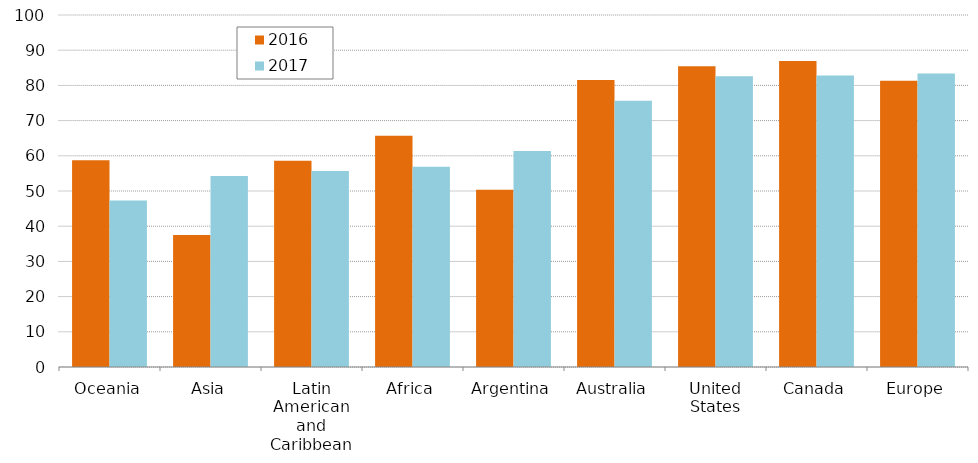
| Category |   2016 |   2017 |
|---|---|---|
| Oceania | 58.752 | 47.27 |
| Asia | 37.467 | 54.23 |
| Latin American and Caribbean | 58.624 | 55.66 |
| Africa | 65.668 | 56.86 |
| Argentina | 50.326 | 61.38 |
| Australia | 81.505 | 75.65 |
| United States | 85.423 | 82.61 |
| Canada | 86.911 | 82.825 |
| Europe | 81.354 | 83.375 |